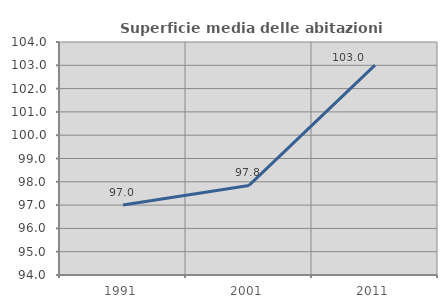
| Category | Superficie media delle abitazioni occupate |
|---|---|
| 1991.0 | 97.004 |
| 2001.0 | 97.845 |
| 2011.0 | 103.004 |